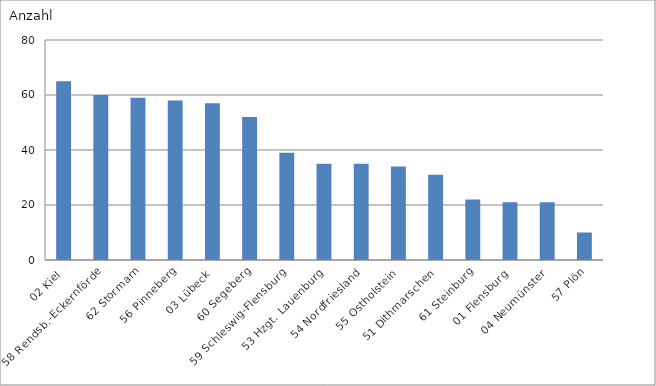
| Category | 02 Kiel |
|---|---|
| 02 Kiel | 65 |
| 58 Rendsb.-Eckernförde | 60 |
| 62 Stormarn | 59 |
| 56 Pinneberg | 58 |
| 03 Lübeck | 57 |
| 60 Segeberg | 52 |
| 59 Schleswig-Flensburg | 39 |
| 53 Hzgt. Lauenburg | 35 |
| 54 Nordfriesland | 35 |
| 55 Ostholstein | 34 |
| 51 Dithmarschen | 31 |
| 61 Steinburg | 22 |
| 01 Flensburg | 21 |
| 04 Neumünster | 21 |
| 57 Plön | 10 |